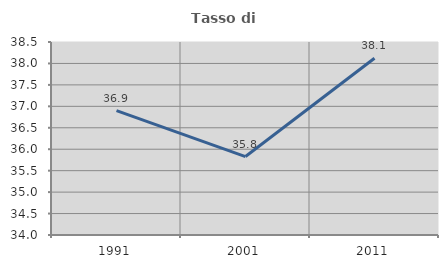
| Category | Tasso di occupazione   |
|---|---|
| 1991.0 | 36.898 |
| 2001.0 | 35.829 |
| 2011.0 | 38.122 |